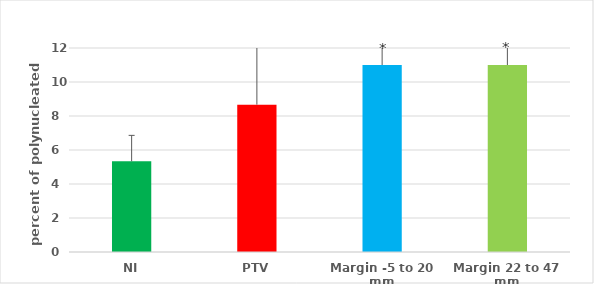
| Category | percent of polynucleated cells |
|---|---|
| NI | 5.333 |
| PTV | 8.667 |
| Margin -5 to 20 mm | 11 |
| Margin 22 to 47 mm | 11 |